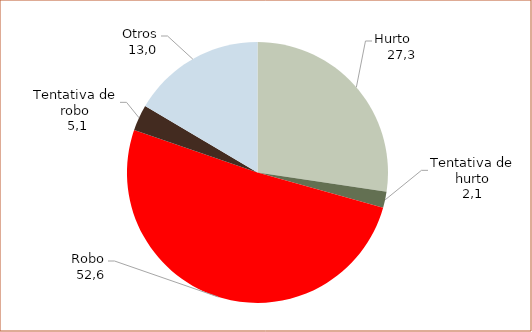
| Category | Series 0 |
|---|---|
| Hurto | 27.26 |
| Tentativa de hurto | 2.005 |
| Robo | 50.731 |
| Tentativa de robo | 3.205 |
| Otros | 16.447 |